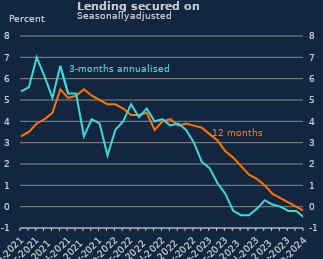
| Category | 12-month |
|---|---|
| Jan-2021 | 3.3 |
| Feb-2021 | 3.5 |
| Mar-2021 | 3.9 |
| Apr-2021 | 4.1 |
| May-2021 | 4.4 |
| Jun-2021 | 5.5 |
| Jul-2021 | 5.1 |
| Aug-2021 | 5.2 |
| Sep-2021 | 5.5 |
| Oct-2021 | 5.2 |
| Nov-2021 | 5 |
| Dec-2021 | 4.8 |
| Jan-2022 | 4.8 |
| Feb-2022 | 4.6 |
| Mar-2022 | 4.3 |
| Apr-2022 | 4.3 |
| May-2022 | 4.4 |
| Jun-2022 | 3.6 |
| Jul-2022 | 4 |
| Aug-2022 | 4.1 |
| Sep-2022 | 3.8 |
| Oct-2022 | 3.9 |
| Nov-2022 | 3.8 |
| Dec-2022 | 3.7 |
| Jan-2023 | 3.4 |
| Feb-2023 | 3.1 |
| Mar-2023 | 2.6 |
| Apr-2023 | 2.3 |
| May-2023 | 1.9 |
| Jun-2023 | 1.5 |
| Jul-2023 | 1.3 |
| Aug-2023 | 1 |
| Sep-2023 | 0.6 |
| Oct-2023 | 0.4 |
| Nov-2023 | 0.2 |
| Dec-2023 | 0 |
| Jan-2024 | -0.2 |